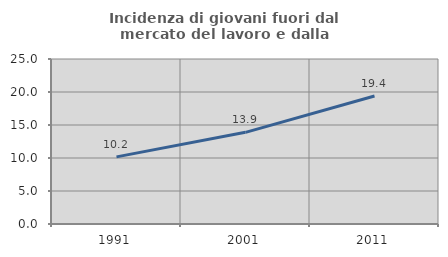
| Category | Incidenza di giovani fuori dal mercato del lavoro e dalla formazione  |
|---|---|
| 1991.0 | 10.169 |
| 2001.0 | 13.889 |
| 2011.0 | 19.388 |